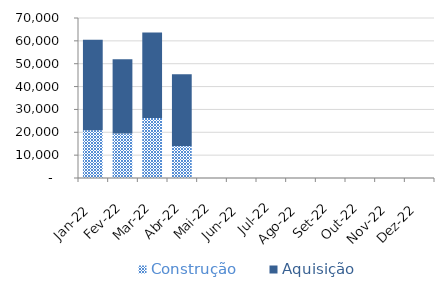
| Category | Construção | Aquisição  |
|---|---|---|
| Jan-22 | 20889 | 39545 |
| Fev-22 | 19505 | 32469 |
| Mar-22 | 26223 | 37423 |
| Abr-22 | 13948 | 31401 |
| Mai-22 | 0 | 0 |
| Jun-22 | 0 | 0 |
| Jul-22 | 0 | 0 |
| Ago-22 | 0 | 0 |
| Set-22 | 0 | 0 |
| Out-22 | 0 | 0 |
| Nov-22 | 0 | 0 |
| Dez-22 | 0 | 0 |